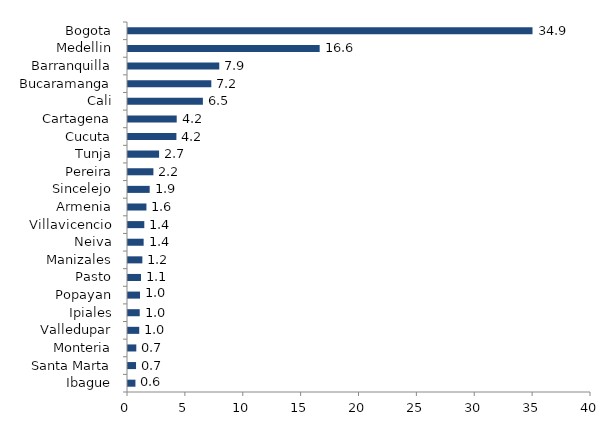
| Category | Series 0 |
|---|---|
| Ibague | 0.643 |
| Santa Marta | 0.695 |
| Monteria | 0.717 |
| Valledupar | 0.972 |
| Ipiales | 1.013 |
| Popayan | 1.039 |
| Pasto | 1.124 |
| Manizales | 1.24 |
| Neiva | 1.352 |
| Villavicencio | 1.408 |
| Armenia | 1.592 |
| Sincelejo | 1.873 |
| Pereira | 2.196 |
| Tunja | 2.686 |
| Cucuta | 4.182 |
| Cartagena | 4.209 |
| Cali | 6.47 |
| Bucaramanga | 7.198 |
| Barranquilla | 7.886 |
| Medellin | 16.56 |
| Bogota | 34.947 |